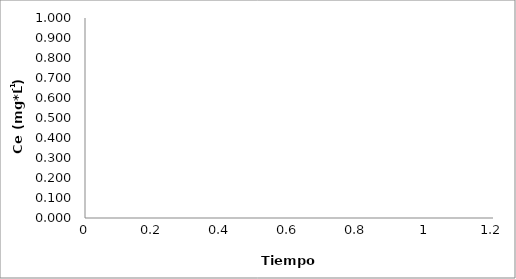
| Category | Series 0 |
|---|---|
|  | 0 |
|  | 0 |
|  | 0 |
|  | 0 |
|  | 0 |
|  | 0 |
|  | 0 |
|  | 0 |
|  | 0 |
|  | 0 |